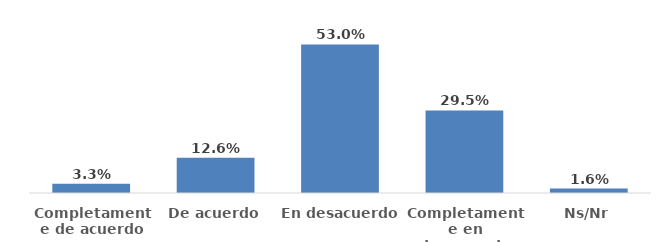
| Category | Series 0 |
|---|---|
| Completamente de acuerdo | 0.033 |
| De acuerdo | 0.126 |
| En desacuerdo | 0.53 |
| Completamente en desacuerdo | 0.295 |
| Ns/Nr | 0.016 |